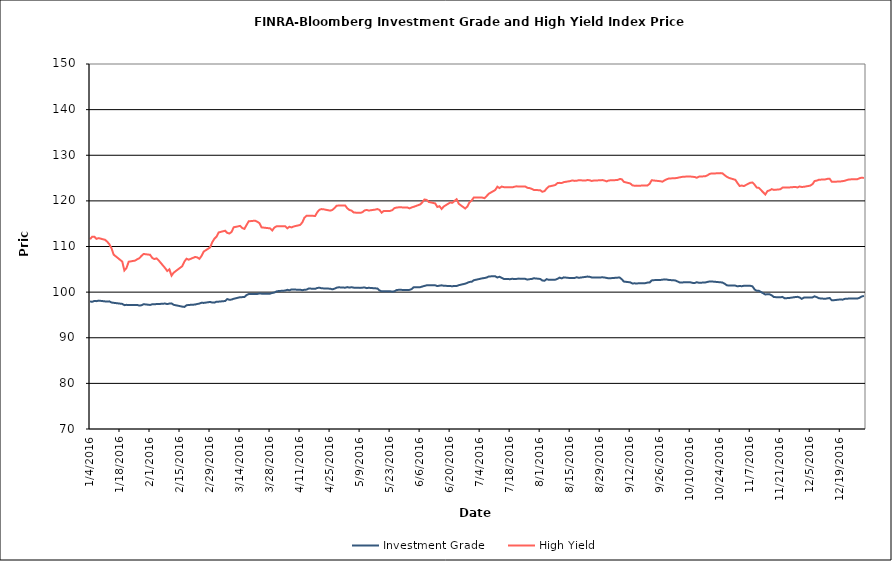
| Category | Investment Grade | High Yield |
|---|---|---|
| 1/4/16 | 97.954 | 111.61 |
| 1/5/16 | 97.883 | 112.157 |
| 1/6/16 | 98.075 | 112.146 |
| 1/7/16 | 98.019 | 111.674 |
| 1/8/16 | 98.141 | 111.833 |
| 1/11/16 | 97.966 | 111.469 |
| 1/12/16 | 97.968 | 111.045 |
| 1/13/16 | 97.973 | 110.498 |
| 1/14/16 | 97.726 | 109.605 |
| 1/15/16 | 97.656 | 108.22 |
| 1/19/16 | 97.422 | 106.701 |
| 1/20/16 | 97.151 | 104.751 |
| 1/21/16 | 97.215 | 105.29 |
| 1/22/16 | 97.163 | 106.657 |
| 1/25/16 | 97.159 | 106.911 |
| 1/26/16 | 97.197 | 107.204 |
| 1/27/16 | 97.048 | 107.442 |
| 1/28/16 | 97.129 | 107.959 |
| 1/29/16 | 97.357 | 108.363 |
| 2/1/16 | 97.19 | 108.18 |
| 2/2/16 | 97.337 | 107.497 |
| 2/3/16 | 97.327 | 107.249 |
| 2/4/16 | 97.387 | 107.393 |
| 2/5/16 | 97.392 | 106.952 |
| 2/8/16 | 97.497 | 105.276 |
| 2/9/16 | 97.38 | 104.63 |
| 2/10/16 | 97.494 | 105 |
| 2/11/16 | 97.536 | 103.609 |
| 2/12/16 | 97.221 | 104.265 |
| 2/16/16 | 96.823 | 105.687 |
| 2/17/16 | 96.752 | 106.697 |
| 2/18/16 | 97.125 | 107.321 |
| 2/19/16 | 97.184 | 107.105 |
| 2/22/16 | 97.277 | 107.702 |
| 2/23/16 | 97.403 | 107.614 |
| 2/24/16 | 97.493 | 107.304 |
| 2/25/16 | 97.671 | 107.935 |
| 2/26/16 | 97.635 | 108.879 |
| 2/29/16 | 97.849 | 109.804 |
| 3/1/16 | 97.704 | 110.942 |
| 3/2/16 | 97.698 | 111.706 |
| 3/3/16 | 97.916 | 112.167 |
| 3/4/16 | 97.913 | 113.082 |
| 3/7/16 | 98.053 | 113.458 |
| 3/8/16 | 98.473 | 112.986 |
| 3/9/16 | 98.318 | 112.846 |
| 3/10/16 | 98.368 | 113.184 |
| 3/11/16 | 98.541 | 114.211 |
| 3/14/16 | 98.884 | 114.51 |
| 3/15/16 | 98.904 | 114.043 |
| 3/16/16 | 98.905 | 113.864 |
| 3/17/16 | 99.356 | 114.716 |
| 3/18/16 | 99.586 | 115.523 |
| 3/21/16 | 99.581 | 115.663 |
| 3/22/16 | 99.59 | 115.435 |
| 3/23/16 | 99.727 | 115.115 |
| 3/24/16 | 99.659 | 114.191 |
| 3/28/16 | 99.666 | 113.974 |
| 3/29/16 | 99.821 | 113.52 |
| 3/30/16 | 99.914 | 114.159 |
| 3/31/16 | 100.16 | 114.42 |
| 4/1/16 | 100.239 | 114.414 |
| 4/4/16 | 100.344 | 114.445 |
| 4/5/16 | 100.51 | 113.977 |
| 4/6/16 | 100.402 | 114.326 |
| 4/7/16 | 100.595 | 114.184 |
| 4/8/16 | 100.553 | 114.388 |
| 4/11/16 | 100.536 | 114.726 |
| 4/12/16 | 100.422 | 115.276 |
| 4/13/16 | 100.523 | 116.313 |
| 4/14/16 | 100.553 | 116.732 |
| 4/15/16 | 100.795 | 116.767 |
| 4/18/16 | 100.717 | 116.694 |
| 4/19/16 | 100.914 | 117.525 |
| 4/20/16 | 100.969 | 118.048 |
| 4/21/16 | 100.831 | 118.202 |
| 4/22/16 | 100.819 | 118.149 |
| 4/25/16 | 100.752 | 117.862 |
| 4/26/16 | 100.613 | 118.006 |
| 4/27/16 | 100.75 | 118.405 |
| 4/28/16 | 100.971 | 118.933 |
| 4/29/16 | 101.057 | 118.977 |
| 5/2/16 | 100.972 | 118.989 |
| 5/3/16 | 101.105 | 118.358 |
| 5/4/16 | 100.988 | 118 |
| 5/5/16 | 101.081 | 117.869 |
| 5/6/16 | 100.977 | 117.444 |
| 5/9/16 | 100.928 | 117.376 |
| 5/10/16 | 100.974 | 117.498 |
| 5/11/16 | 101.032 | 117.891 |
| 5/12/16 | 100.877 | 118.018 |
| 5/13/16 | 100.95 | 117.876 |
| 5/16/16 | 100.827 | 118.086 |
| 5/17/16 | 100.809 | 118.204 |
| 5/18/16 | 100.373 | 118.032 |
| 5/19/16 | 100.166 | 117.415 |
| 5/20/16 | 100.176 | 117.792 |
| 5/23/16 | 100.188 | 117.807 |
| 5/24/16 | 100.101 | 117.977 |
| 5/25/16 | 100.192 | 118.409 |
| 5/26/16 | 100.45 | 118.541 |
| 5/27/16 | 100.506 | 118.585 |
| 5/31/16 | 100.47 | 118.559 |
| 6/1/16 | 100.493 | 118.352 |
| 6/2/16 | 100.662 | 118.563 |
| 6/3/16 | 101.087 | 118.704 |
| 6/6/16 | 101.088 | 119.22 |
| 6/7/16 | 101.226 | 119.692 |
| 6/8/16 | 101.365 | 120.306 |
| 6/9/16 | 101.487 | 120.209 |
| 6/10/16 | 101.496 | 119.766 |
| 6/13/16 | 101.487 | 119.446 |
| 6/14/16 | 101.329 | 118.664 |
| 6/15/16 | 101.419 | 118.829 |
| 6/16/16 | 101.489 | 118.23 |
| 6/17/16 | 101.401 | 118.77 |
| 6/20/16 | 101.327 | 119.641 |
| 6/21/16 | 101.29 | 119.573 |
| 6/22/16 | 101.359 | 119.983 |
| 6/23/16 | 101.335 | 120.37 |
| 6/24/16 | 101.522 | 119.364 |
| 6/27/16 | 101.852 | 118.321 |
| 6/28/16 | 102.038 | 118.764 |
| 6/29/16 | 102.242 | 119.679 |
| 6/30/16 | 102.263 | 120.071 |
| 7/1/16 | 102.602 | 120.728 |
| 7/5/16 | 103.03 | 120.715 |
| 7/6/16 | 103.096 | 120.597 |
| 7/7/16 | 103.202 | 121.055 |
| 7/8/16 | 103.443 | 121.566 |
| 7/11/16 | 103.472 | 122.378 |
| 7/12/16 | 103.204 | 123.104 |
| 7/13/16 | 103.367 | 122.802 |
| 7/14/16 | 103.127 | 123.13 |
| 7/15/16 | 102.886 | 123.011 |
| 7/18/16 | 102.841 | 122.979 |
| 7/19/16 | 102.936 | 122.968 |
| 7/20/16 | 102.851 | 123.102 |
| 7/21/16 | 102.9 | 123.186 |
| 7/22/16 | 102.963 | 123.151 |
| 7/25/16 | 102.905 | 123.163 |
| 7/26/16 | 102.742 | 122.864 |
| 7/27/16 | 102.84 | 122.804 |
| 7/28/16 | 102.876 | 122.636 |
| 7/29/16 | 103.038 | 122.399 |
| 8/1/16 | 102.887 | 122.327 |
| 8/2/16 | 102.539 | 121.987 |
| 8/3/16 | 102.504 | 122.144 |
| 8/4/16 | 102.848 | 122.718 |
| 8/5/16 | 102.692 | 123.146 |
| 8/8/16 | 102.723 | 123.464 |
| 8/9/16 | 102.899 | 123.896 |
| 8/10/16 | 103.176 | 123.947 |
| 8/11/16 | 103.017 | 123.908 |
| 8/12/16 | 103.238 | 124.104 |
| 8/15/16 | 103.08 | 124.345 |
| 8/16/16 | 103.077 | 124.48 |
| 8/17/16 | 103.089 | 124.378 |
| 8/18/16 | 103.264 | 124.419 |
| 8/19/16 | 103.14 | 124.527 |
| 8/22/16 | 103.33 | 124.449 |
| 8/23/16 | 103.408 | 124.567 |
| 8/24/16 | 103.36 | 124.527 |
| 8/25/16 | 103.219 | 124.364 |
| 8/26/16 | 103.182 | 124.463 |
| 8/29/16 | 103.212 | 124.508 |
| 8/30/16 | 103.254 | 124.565 |
| 8/31/16 | 103.204 | 124.444 |
| 9/1/16 | 103.106 | 124.275 |
| 9/2/16 | 103.02 | 124.482 |
| 9/6/16 | 103.173 | 124.57 |
| 9/7/16 | 103.214 | 124.769 |
| 9/8/16 | 102.844 | 124.765 |
| 9/9/16 | 102.316 | 124.169 |
| 9/12/16 | 102.142 | 123.817 |
| 9/13/16 | 101.89 | 123.406 |
| 9/14/16 | 101.934 | 123.322 |
| 9/15/16 | 101.875 | 123.342 |
| 9/16/16 | 101.964 | 123.323 |
| 9/19/16 | 101.972 | 123.381 |
| 9/20/16 | 102.086 | 123.37 |
| 9/21/16 | 102.085 | 123.718 |
| 9/22/16 | 102.565 | 124.528 |
| 9/23/16 | 102.627 | 124.463 |
| 9/26/16 | 102.662 | 124.311 |
| 9/27/16 | 102.729 | 124.202 |
| 9/28/16 | 102.795 | 124.501 |
| 9/29/16 | 102.757 | 124.732 |
| 9/30/16 | 102.664 | 124.902 |
| 10/3/16 | 102.561 | 124.974 |
| 10/4/16 | 102.348 | 125.042 |
| 10/5/16 | 102.133 | 125.154 |
| 10/6/16 | 102.123 | 125.243 |
| 10/7/16 | 102.143 | 125.303 |
| 10/10/16 | 102.15 | 125.35 |
| 10/11/16 | 102.031 | 125.271 |
| 10/12/16 | 101.979 | 125.249 |
| 10/13/16 | 102.181 | 125.06 |
| 10/14/16 | 102.049 | 125.313 |
| 10/17/16 | 102.116 | 125.403 |
| 10/18/16 | 102.243 | 125.59 |
| 10/19/16 | 102.331 | 125.904 |
| 10/20/16 | 102.341 | 126.012 |
| 10/21/16 | 102.286 | 126.004 |
| 10/24/16 | 102.156 | 126.084 |
| 10/25/16 | 102.106 | 126.031 |
| 10/26/16 | 101.852 | 125.645 |
| 10/27/16 | 101.515 | 125.294 |
| 10/28/16 | 101.435 | 125.038 |
| 10/31/16 | 101.431 | 124.615 |
| 11/1/16 | 101.273 | 123.926 |
| 11/2/16 | 101.354 | 123.269 |
| 11/3/16 | 101.293 | 123.356 |
| 11/4/16 | 101.395 | 123.256 |
| 11/7/16 | 101.386 | 123.972 |
| 11/8/16 | 101.271 | 124.022 |
| 11/9/16 | 100.589 | 123.549 |
| 11/10/16 | 100.282 | 122.922 |
| 11/11/16 | 100.288 | 122.849 |
| 11/14/16 | 99.481 | 121.393 |
| 11/15/16 | 99.542 | 122.154 |
| 11/16/16 | 99.526 | 122.299 |
| 11/17/16 | 99.292 | 122.572 |
| 11/18/16 | 98.92 | 122.404 |
| 11/21/16 | 98.856 | 122.543 |
| 11/22/16 | 98.95 | 122.907 |
| 11/23/16 | 98.65 | 122.942 |
| 11/25/16 | 98.709 | 122.939 |
| 11/28/16 | 98.919 | 123.06 |
| 11/29/16 | 98.971 | 122.942 |
| 11/30/16 | 98.83 | 123.153 |
| 12/1/16 | 98.527 | 123.047 |
| 12/2/16 | 98.798 | 123.085 |
| 12/5/16 | 98.825 | 123.35 |
| 12/6/16 | 98.837 | 123.66 |
| 12/7/16 | 99.082 | 124.346 |
| 12/8/16 | 98.897 | 124.442 |
| 12/9/16 | 98.652 | 124.634 |
| 12/12/16 | 98.532 | 124.706 |
| 12/13/16 | 98.641 | 124.826 |
| 12/14/16 | 98.708 | 124.841 |
| 12/15/16 | 98.218 | 124.209 |
| 12/16/16 | 98.231 | 124.196 |
| 12/19/16 | 98.398 | 124.25 |
| 12/20/16 | 98.342 | 124.323 |
| 12/21/16 | 98.52 | 124.401 |
| 12/22/16 | 98.526 | 124.557 |
| 12/23/16 | 98.608 | 124.7 |
| 12/27/16 | 98.599 | 124.757 |
| 12/28/16 | 98.772 | 124.979 |
| 12/29/16 | 99.053 | 125.079 |
| 12/30/16 | 99.166 | 125.024 |